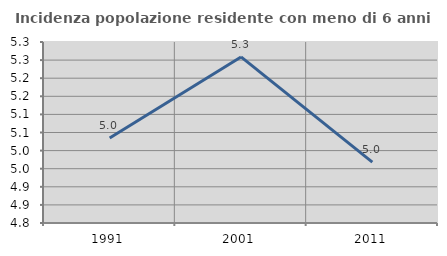
| Category | Incidenza popolazione residente con meno di 6 anni |
|---|---|
| 1991.0 | 5.035 |
| 2001.0 | 5.259 |
| 2011.0 | 4.968 |